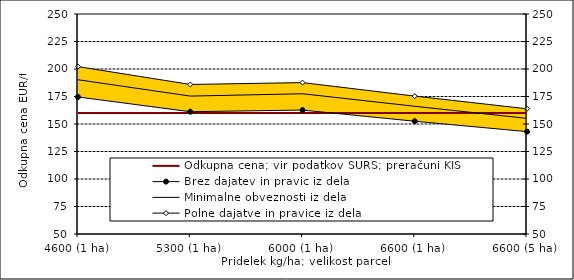
| Category | Odkupna cena; vir podatkov SURS; preračuni KIS |
|---|---|
| 4600 (1ha) | 160 |
| 5300 (1ha) | 160 |
| 6000 (1ha) | 160 |
| 6600 (1ha) | 160 |
| 6600 (5ha) | 160 |